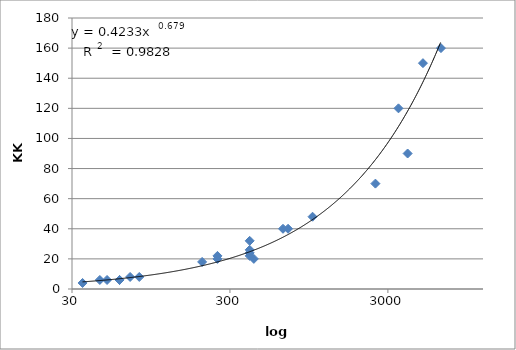
| Category | Series 0 |
|---|---|
| 35.0 | 4 |
| 45.0 | 6 |
| 50.0 | 6 |
| 60.0 | 6 |
| 60.0 | 6 |
| 70.0 | 8 |
| 80.0 | 8 |
| 200.0 | 18 |
| 250.0 | 22 |
| 250.0 | 20 |
| 400.0 | 26 |
| 400.0 | 24 |
| 400.0 | 22 |
| 400.0 | 32 |
| 425.0 | 20 |
| 650.0 | 40 |
| 700.0 | 40 |
| 1000.0 | 48 |
| 2500.0 | 70 |
| 3500.0 | 120 |
| 4000.0 | 90 |
| 5000.0 | 150 |
| 6500.0 | 160 |